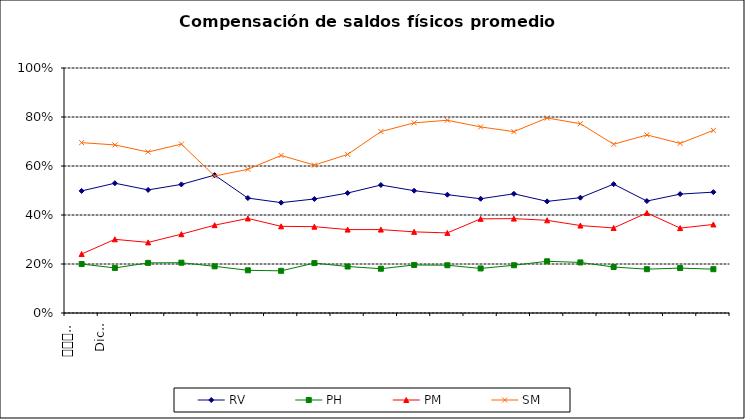
| Category | RV | PH | PM | SM |
|---|---|---|---|---|
| 0 | 0.498 | 0.2 | 0.241 | 0.695 |
| 1 | 0.53 | 0.184 | 0.301 | 0.686 |
| 2 | 0.502 | 0.205 | 0.288 | 0.657 |
| 3 | 0.525 | 0.205 | 0.322 | 0.689 |
| 4 | 0.563 | 0.19 | 0.358 | 0.559 |
| 5 | 0.469 | 0.174 | 0.386 | 0.587 |
| 6 | 0.45 | 0.172 | 0.354 | 0.643 |
| 7 | 0.465 | 0.204 | 0.352 | 0.604 |
| 8 | 0.49 | 0.19 | 0.34 | 0.647 |
| 9 | 0.522 | 0.181 | 0.34 | 0.74 |
| 10 | 0.499 | 0.196 | 0.331 | 0.776 |
| 11 | 0.483 | 0.195 | 0.327 | 0.787 |
| 12 | 0.466 | 0.182 | 0.384 | 0.759 |
| 13 | 0.486 | 0.195 | 0.385 | 0.74 |
| 14 | 0.456 | 0.211 | 0.378 | 0.796 |
| 15 | 0.471 | 0.206 | 0.357 | 0.773 |
| 16 | 0.526 | 0.188 | 0.347 | 0.689 |
| 17 | 0.457 | 0.179 | 0.409 | 0.727 |
| 18 | 0.485 | 0.183 | 0.347 | 0.692 |
| 19 | 0.493 | 0.179 | 0.361 | 0.746 |